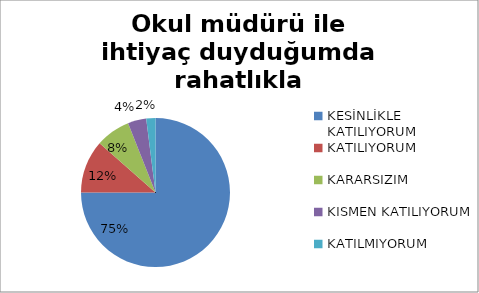
| Category | Okul müdürü ile ihtiyaç duyduğumda rahatlıkla konuşabiliyorum. |
|---|---|
| KESİNLİKLE KATILIYORUM | 150 |
| KATILIYORUM | 23 |
| KARARSIZIM | 15 |
| KISMEN KATILIYORUM | 8 |
| KATILMIYORUM | 4 |